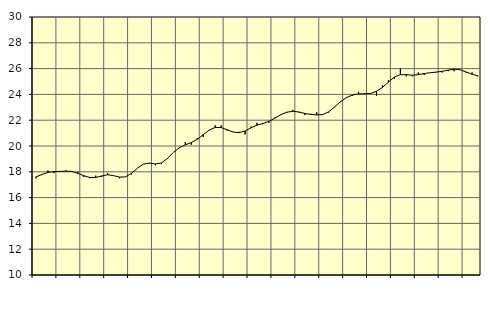
| Category | Piggar | Finansiell verksamhet, företagstjänster, SNI 64-82 |
|---|---|---|
| nan | 17.5 | 17.61 |
| 1.0 | 17.8 | 17.79 |
| 1.0 | 18.1 | 17.95 |
| 1.0 | 17.9 | 18.02 |
| nan | 18 | 18.03 |
| 2.0 | 18.1 | 18.05 |
| 2.0 | 18 | 18.03 |
| 2.0 | 18 | 17.88 |
| nan | 17.6 | 17.7 |
| 3.0 | 17.5 | 17.56 |
| 3.0 | 17.7 | 17.56 |
| 3.0 | 17.6 | 17.68 |
| nan | 17.9 | 17.77 |
| 4.0 | 17.7 | 17.7 |
| 4.0 | 17.5 | 17.59 |
| 4.0 | 17.6 | 17.61 |
| nan | 17.8 | 17.89 |
| 5.0 | 18.3 | 18.29 |
| 5.0 | 18.6 | 18.6 |
| 5.0 | 18.7 | 18.67 |
| nan | 18.5 | 18.61 |
| 6.0 | 18.6 | 18.69 |
| 6.0 | 19 | 19.03 |
| 6.0 | 19.5 | 19.5 |
| nan | 19.9 | 19.86 |
| 7.0 | 20.3 | 20.09 |
| 7.0 | 20.1 | 20.27 |
| 7.0 | 20.6 | 20.52 |
| nan | 20.7 | 20.87 |
| 8.0 | 21.2 | 21.23 |
| 8.0 | 21.6 | 21.44 |
| 8.0 | 21.6 | 21.43 |
| nan | 21.2 | 21.26 |
| 9.0 | 21.1 | 21.08 |
| 9.0 | 21.1 | 21.03 |
| 9.0 | 20.9 | 21.16 |
| nan | 21.5 | 21.41 |
| 10.0 | 21.8 | 21.62 |
| 10.0 | 21.7 | 21.74 |
| 10.0 | 21.8 | 21.91 |
| nan | 22.2 | 22.16 |
| 11.0 | 22.4 | 22.43 |
| 11.0 | 22.6 | 22.62 |
| 11.0 | 22.8 | 22.69 |
| nan | 22.6 | 22.64 |
| 12.0 | 22.4 | 22.52 |
| 12.0 | 22.5 | 22.45 |
| 12.0 | 22.6 | 22.41 |
| nan | 22.4 | 22.44 |
| 13.0 | 22.6 | 22.65 |
| 13.0 | 23 | 23.03 |
| 13.0 | 23.4 | 23.44 |
| nan | 23.8 | 23.76 |
| 14.0 | 23.9 | 23.95 |
| 14.0 | 24.2 | 24.04 |
| 14.0 | 24.1 | 24.05 |
| nan | 24.1 | 24.07 |
| 15.0 | 23.9 | 24.24 |
| 15.0 | 24.7 | 24.54 |
| 15.0 | 25.1 | 24.95 |
| nan | 25.2 | 25.35 |
| 16.0 | 26 | 25.53 |
| 16.0 | 25.4 | 25.53 |
| 16.0 | 25.4 | 25.49 |
| nan | 25.7 | 25.53 |
| 17.0 | 25.5 | 25.62 |
| 17.0 | 25.7 | 25.68 |
| 17.0 | 25.7 | 25.73 |
| nan | 25.7 | 25.79 |
| 18.0 | 25.8 | 25.88 |
| 18.0 | 25.8 | 25.96 |
| 18.0 | 25.9 | 25.91 |
| nan | 25.7 | 25.74 |
| 19.0 | 25.7 | 25.56 |
| 19.0 | 25.4 | 25.44 |